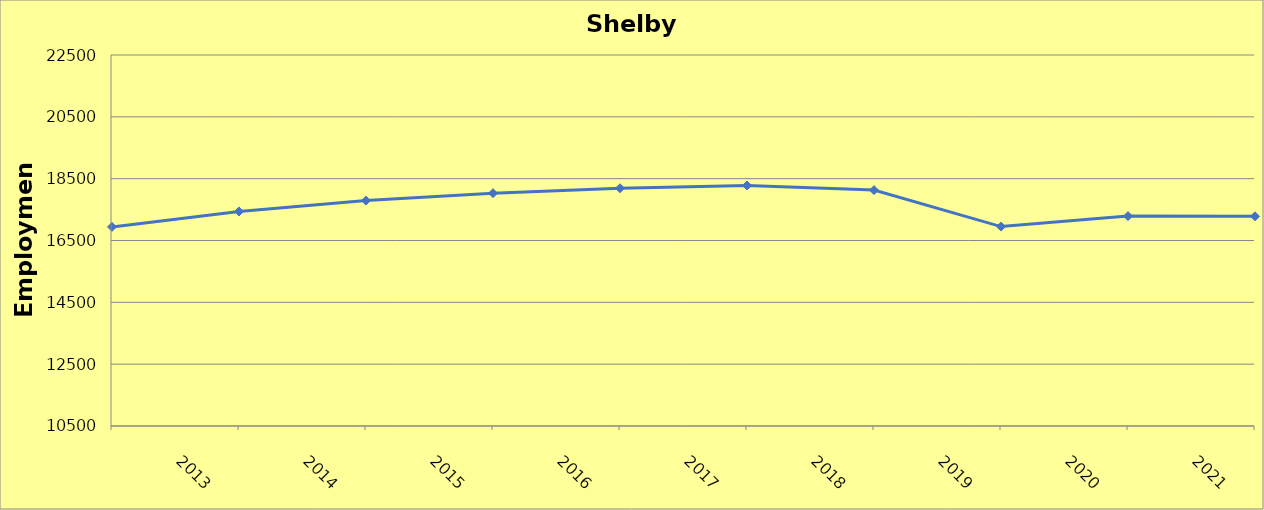
| Category | Shelby County |
|---|---|
| 2013.0 | 16940 |
| 2014.0 | 17440 |
| 2015.0 | 17790 |
| 2016.0 | 18030 |
| 2017.0 | 18190 |
| 2018.0 | 18280 |
| 2019.0 | 18130 |
| 2020.0 | 16950 |
| 2021.0 | 17290 |
| 2022.0 | 17281 |